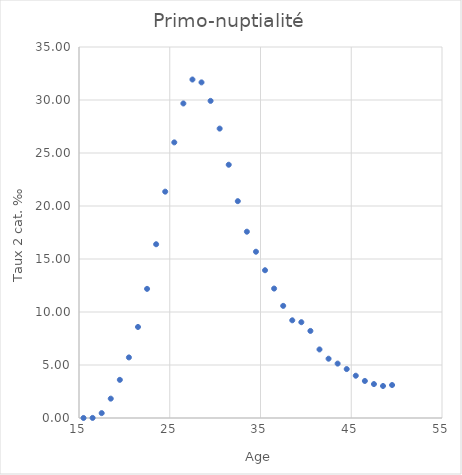
| Category | Primo-nuptialité |
|---|---|
| 15.5 | 0.003 |
| 16.5 | 0.008 |
| 17.5 | 0.461 |
| 18.5 | 1.826 |
| 19.5 | 3.599 |
| 20.5 | 5.716 |
| 21.5 | 8.588 |
| 22.5 | 12.182 |
| 23.5 | 16.392 |
| 24.5 | 21.353 |
| 25.5 | 26.001 |
| 26.5 | 29.673 |
| 27.5 | 31.932 |
| 28.5 | 31.662 |
| 29.5 | 29.917 |
| 30.5 | 27.303 |
| 31.5 | 23.892 |
| 32.5 | 20.456 |
| 33.5 | 17.576 |
| 34.5 | 15.686 |
| 35.5 | 13.94 |
| 36.5 | 12.211 |
| 37.5 | 10.578 |
| 38.5 | 9.217 |
| 39.5 | 9.039 |
| 40.5 | 8.214 |
| 41.5 | 6.469 |
| 42.5 | 5.594 |
| 43.5 | 5.133 |
| 44.5 | 4.616 |
| 45.5 | 3.989 |
| 46.5 | 3.494 |
| 47.5 | 3.2 |
| 48.5 | 3.019 |
| 49.5 | 3.111 |